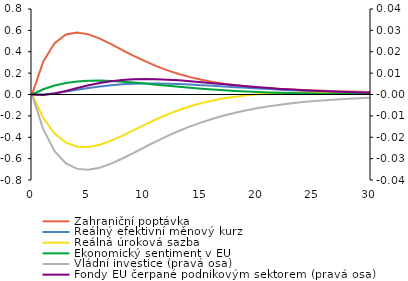
| Category | Zahraniční poptávka | Reálný efektivní měnový kurz | Reálná úroková sazba | Ekonomický sentiment v EU |
|---|---|---|---|---|
| 0.0 | 0 | 0 | 0 | 0 |
| 1.0 | 0.309 | 0.001 | -0.22 | 0.049 |
| 2.0 | 0.481 | 0.012 | -0.366 | 0.084 |
| 3.0 | 0.561 | 0.028 | -0.451 | 0.108 |
| 4.0 | 0.581 | 0.045 | -0.489 | 0.123 |
| 5.0 | 0.562 | 0.061 | -0.492 | 0.129 |
| 6.0 | 0.522 | 0.076 | -0.47 | 0.13 |
| 7.0 | 0.471 | 0.087 | -0.432 | 0.127 |
| 8.0 | 0.416 | 0.095 | -0.385 | 0.12 |
| 9.0 | 0.362 | 0.1 | -0.333 | 0.112 |
| 10.0 | 0.312 | 0.103 | -0.281 | 0.102 |
| 11.0 | 0.266 | 0.103 | -0.232 | 0.092 |
| 12.0 | 0.226 | 0.101 | -0.186 | 0.082 |
| 13.0 | 0.192 | 0.098 | -0.146 | 0.072 |
| 14.0 | 0.163 | 0.093 | -0.11 | 0.062 |
| 15.0 | 0.138 | 0.088 | -0.08 | 0.054 |
| 16.0 | 0.118 | 0.081 | -0.056 | 0.046 |
| 17.0 | 0.101 | 0.075 | -0.036 | 0.039 |
| 18.0 | 0.087 | 0.069 | -0.02 | 0.033 |
| 19.0 | 0.076 | 0.063 | -0.008 | 0.028 |
| 20.0 | 0.067 | 0.057 | 0.001 | 0.024 |
| 21.0 | 0.059 | 0.051 | 0.008 | 0.02 |
| 22.0 | 0.052 | 0.045 | 0.012 | 0.017 |
| 23.0 | 0.047 | 0.04 | 0.015 | 0.014 |
| 24.0 | 0.042 | 0.036 | 0.016 | 0.012 |
| 25.0 | 0.038 | 0.032 | 0.017 | 0.01 |
| 26.0 | 0.034 | 0.028 | 0.017 | 0.008 |
| 27.0 | 0.031 | 0.025 | 0.016 | 0.007 |
| 28.0 | 0.028 | 0.022 | 0.015 | 0.006 |
| 29.0 | 0.026 | 0.019 | 0.014 | 0.005 |
| 30.0 | 0.023 | 0.017 | 0.013 | 0.004 |